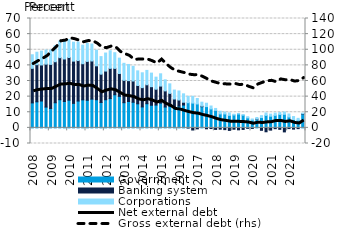
| Category | Government | Banking system | Corporations |
|---|---|---|---|
| 2008.0 | 15.98 | 22.129 | 8.686 |
| 2008.0 | 16.672 | 23.786 | 7.961 |
| 2008.0 | 17.205 | 23.055 | 8.864 |
| 2008.0 | 13.305 | 27.479 | 9.001 |
| 2009.0 | 12.421 | 28.214 | 9.185 |
| 2009.0 | 16.073 | 26.257 | 10.297 |
| 2009.0 | 18.018 | 26.908 | 10.607 |
| 2009.0 | 16.892 | 27.199 | 11.642 |
| 2010.0 | 17.709 | 27.323 | 11.434 |
| 2010.0 | 15.677 | 27.05 | 12.099 |
| 2010.0 | 17.174 | 25.913 | 11.79 |
| 2010.0 | 17.938 | 23.117 | 11.88 |
| 2011.0 | 17.66 | 24.887 | 11.548 |
| 2011.0 | 18.395 | 24.412 | 10.845 |
| 2011.0 | 18.018 | 21.689 | 10.013 |
| 2011.0 | 16.258 | 18.104 | 11.245 |
| 2012.0 | 18.001 | 18.362 | 11.53 |
| 2012.0 | 18.758 | 19.341 | 11.252 |
| 2012.0 | 21.196 | 16.894 | 10.013 |
| 2012.0 | 20.171 | 14.629 | 9.826 |
| 2013.0 | 16.11 | 14.328 | 10.887 |
| 2013.0 | 16.882 | 13.34 | 10.367 |
| 2013.0 | 16.389 | 13.602 | 9.401 |
| 2013.0 | 15.4 | 11.723 | 9.37 |
| 2014.0 | 13.401 | 12.351 | 9.502 |
| 2014.0 | 15.448 | 12.137 | 9.187 |
| 2014.0 | 14.465 | 11.891 | 8.697 |
| 2014.0 | 14.601 | 10.149 | 7.703 |
| 2015.0 | 15.845 | 10.906 | 7.86 |
| 2015.0 | 13.34 | 10.329 | 7.084 |
| 2015.0 | 13.85 | 8.225 | 6.106 |
| 2015.0 | 12.857 | 5.629 | 5.704 |
| 2016.0 | 13.888 | 3.932 | 5.793 |
| 2016.0 | 14.612 | 1.8 | 5.376 |
| 2016.0 | 16.116 | -0.068 | 4.089 |
| 2016.0 | 15.868 | -1.368 | 4.316 |
| 2017.0 | 15.314 | -0.624 | 3.491 |
| 2017.0 | 13.558 | 0.346 | 2.536 |
| 2017.0 | 13.622 | -0.599 | 2.153 |
| 2017.0 | 12.115 | -0.426 | 1.875 |
| 2018.0 | 11.193 | -0.991 | 1.242 |
| 2018.0 | 8.939 | -0.842 | 1.709 |
| 2018.0 | 8.903 | -1.124 | 1.228 |
| 2018.0 | 8.007 | -1.622 | 1.552 |
| 2019.0 | 8.231 | -0.872 | 0.514 |
| 2019.0 | 8.893 | -1.257 | 0.04 |
| 2019.0 | 8.132 | -1.015 | 0.269 |
| 2019.0 | 6.395 | -0.294 | 0.746 |
| 2020.0 | 5 | -0.371 | 0.688 |
| 2020.0 | 5.539 | 0.137 | 0.971 |
| 2020.0 | 6.595 | -1.564 | 1.212 |
| 2020.0 | 7.996 | -2.495 | 1.529 |
| 2021.0 | 7.472 | -1.442 | 1.326 |
| 2021.0 | 8.004 | -0.52 | 1.429 |
| 2021.0 | 8.615 | -0.942 | 1.197 |
| 2021.0 | 8.674 | -2.575 | 1.467 |
| 2022.0 | 6.948 | -0.447 | 1.942 |
| 2022.0 | 5.372 | -0.815 | 1.872 |
| 2022.0 | 4.903 | -0.491 | 1.186 |
| 2022.0 | 8.855 | 0.246 | 0.324 |